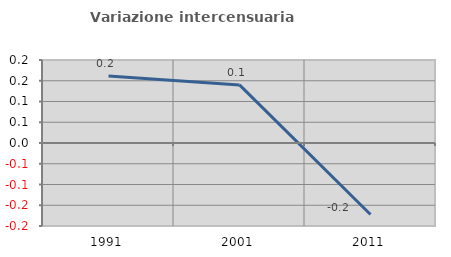
| Category | Variazione intercensuaria annua |
|---|---|
| 1991.0 | 0.161 |
| 2001.0 | 0.14 |
| 2011.0 | -0.172 |